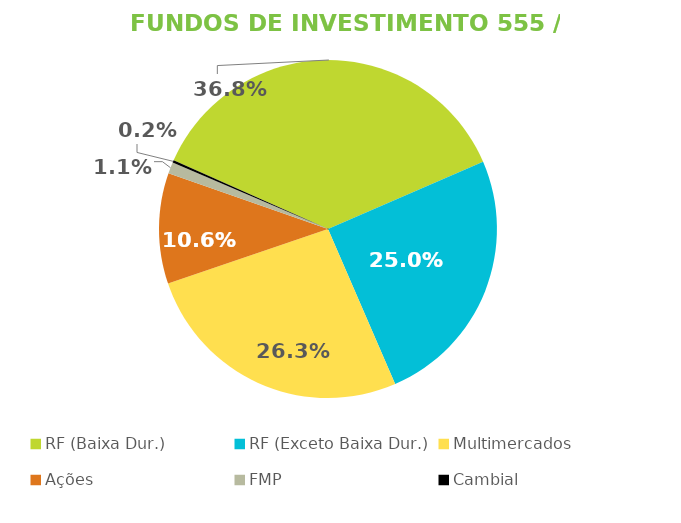
| Category | Fundos de Investimento 555 / FMP |
|---|---|
| RF (Baixa Dur.) | 0.368 |
| RF (Exceto Baixa Dur.) | 0.25 |
| Multimercados | 0.263 |
| Ações | 0.106 |
| FMP | 0.011 |
| Cambial | 0.002 |